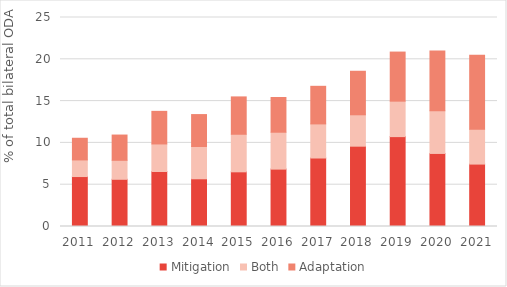
| Category | Mitigation | Both | Adaptation |
|---|---|---|---|
| 2011.0 | 5.975 | 1.989 | 2.591 |
| 2012.0 | 5.647 | 2.271 | 3.021 |
| 2013.0 | 6.582 | 3.292 | 3.9 |
| 2014.0 | 5.708 | 3.864 | 3.816 |
| 2015.0 | 6.54 | 4.494 | 4.468 |
| 2016.0 | 6.864 | 4.413 | 4.151 |
| 2017.0 | 8.193 | 4.078 | 4.498 |
| 2018.0 | 9.607 | 3.756 | 5.206 |
| 2019.0 | 10.752 | 4.241 | 5.872 |
| 2020.0 | 8.739 | 5.096 | 7.168 |
| 2021.0 | 7.465 | 4.156 | 8.852 |